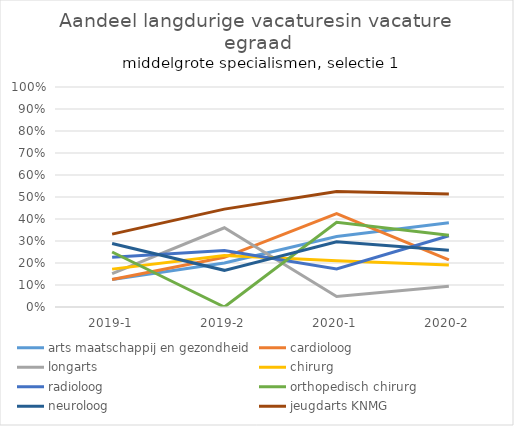
| Category | arts maatschappij en gezondheid | cardioloog | longarts | chirurg | radioloog | orthopedisch chirurg | neuroloog | jeugdarts KNMG |
|---|---|---|---|---|---|---|---|---|
| 2019-1 | 0.125 | 0.125 | 0.152 | 0.172 | 0.226 | 0.25 | 0.289 | 0.331 |
| 2019-2 | 0.2 | 0.226 | 0.36 | 0.234 | 0.256 | 0 | 0.167 | 0.445 |
| 2020-1 | 0.32 | 0.424 | 0.048 | 0.21 | 0.173 | 0.385 | 0.296 | 0.525 |
| 2020-2 | 0.383 | 0.214 | 0.094 | 0.19 | 0.324 | 0.326 | 0.258 | 0.514 |